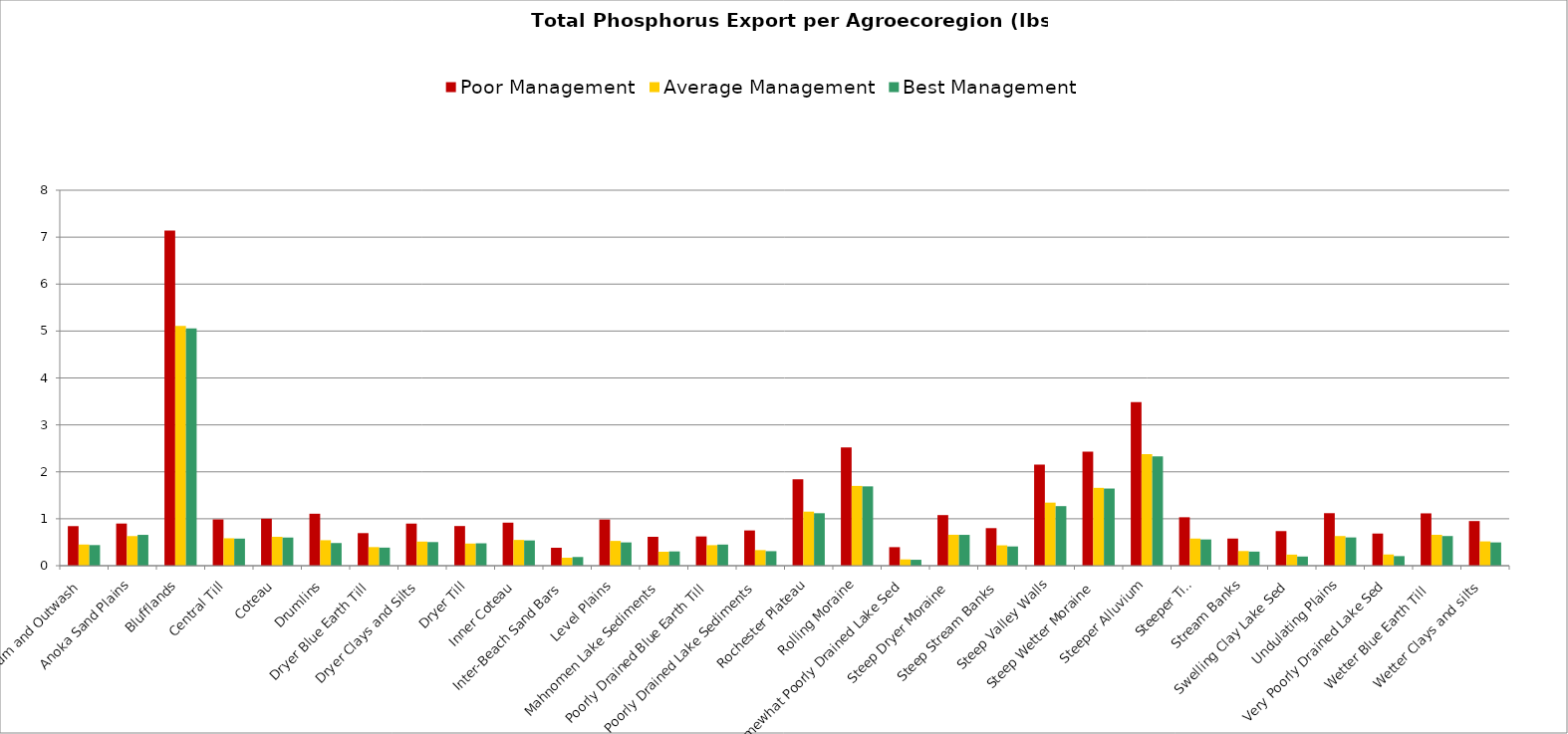
| Category | Poor Management | Average Management | Best Management |
|---|---|---|---|
| Alluvium and Outwash | 0.843 | 0.451 | 0.439 |
| Anoka Sand Plains | 0.898 | 0.631 | 0.657 |
| Blufflands | 7.141 | 5.107 | 5.054 |
| Central Till | 0.986 | 0.584 | 0.577 |
| Coteau | 1.001 | 0.616 | 0.6 |
| Drumlins | 1.107 | 0.543 | 0.483 |
| Dryer Blue Earth Till | 0.694 | 0.396 | 0.385 |
| Dryer Clays and Silts | 0.897 | 0.514 | 0.503 |
| Dryer Till | 0.845 | 0.472 | 0.477 |
| Inner Coteau | 0.917 | 0.549 | 0.538 |
| Inter-Beach Sand Bars | 0.382 | 0.17 | 0.185 |
| Level Plains | 0.983 | 0.528 | 0.496 |
| Mahnomen Lake Sediments | 0.616 | 0.297 | 0.304 |
| Poorly Drained Blue Earth Till | 0.623 | 0.437 | 0.45 |
| Poorly Drained Lake Sediments | 0.751 | 0.332 | 0.309 |
| Rochester Plateau | 1.841 | 1.152 | 1.118 |
| Rolling Moraine | 2.518 | 1.7 | 1.69 |
| Somewhat Poorly Drained Lake Sed | 0.395 | 0.134 | 0.126 |
| Steep Dryer Moraine | 1.078 | 0.659 | 0.657 |
| Steep Stream Banks | 0.8 | 0.434 | 0.41 |
| Steep Valley Walls | 2.156 | 1.344 | 1.269 |
| Steep Wetter Moraine | 2.431 | 1.659 | 1.644 |
| Steeper Alluvium | 3.485 | 2.378 | 2.329 |
| Steeper Till | 1.032 | 0.578 | 0.559 |
| Stream Banks | 0.578 | 0.312 | 0.3 |
| Swelling Clay Lake Sed | 0.737 | 0.236 | 0.195 |
| Undulating Plains | 1.119 | 0.632 | 0.602 |
| Very Poorly Drained Lake Sed | 0.685 | 0.239 | 0.204 |
| Wetter Blue Earth Till  | 1.115 | 0.658 | 0.632 |
| Wetter Clays and silts | 0.951 | 0.518 | 0.496 |